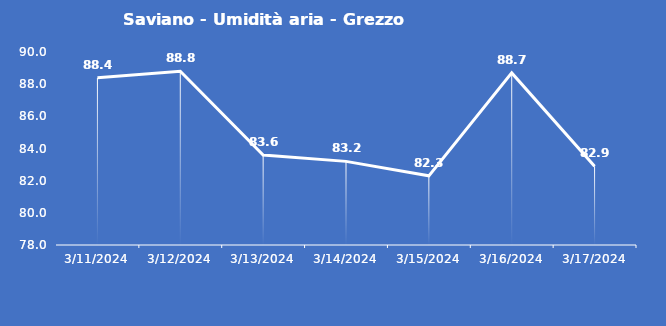
| Category | Saviano - Umidità aria - Grezzo (%) |
|---|---|
| 3/11/24 | 88.4 |
| 3/12/24 | 88.8 |
| 3/13/24 | 83.6 |
| 3/14/24 | 83.2 |
| 3/15/24 | 82.3 |
| 3/16/24 | 88.7 |
| 3/17/24 | 82.9 |